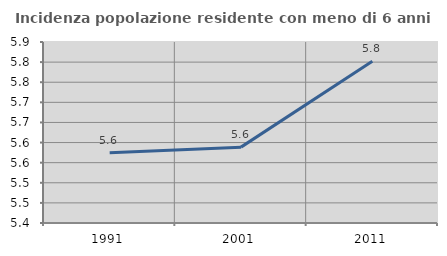
| Category | Incidenza popolazione residente con meno di 6 anni |
|---|---|
| 1991.0 | 5.575 |
| 2001.0 | 5.589 |
| 2011.0 | 5.802 |